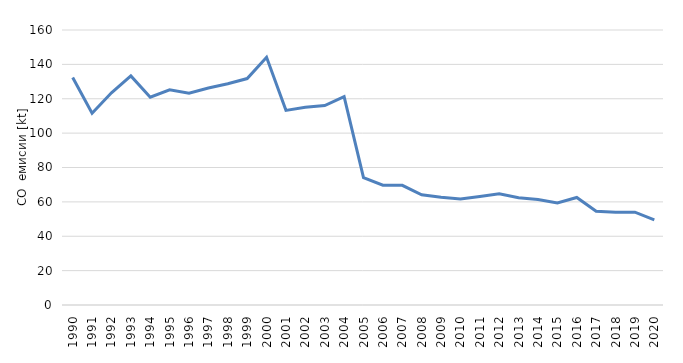
| Category | Series 0 |
|---|---|
| 1990.0 | 132.397 |
| 1991.0 | 111.538 |
| 1992.0 | 123.461 |
| 1993.0 | 133.28 |
| 1994.0 | 120.871 |
| 1995.0 | 125.249 |
| 1996.0 | 123.167 |
| 1997.0 | 126.295 |
| 1998.0 | 128.723 |
| 1999.0 | 131.742 |
| 2000.0 | 144.144 |
| 2001.0 | 113.242 |
| 2002.0 | 115.029 |
| 2003.0 | 116.052 |
| 2004.0 | 121.204 |
| 2005.0 | 74.151 |
| 2006.0 | 69.736 |
| 2007.0 | 69.639 |
| 2008.0 | 64.089 |
| 2009.0 | 62.669 |
| 2010.0 | 61.651 |
| 2011.0 | 63.17 |
| 2012.0 | 64.753 |
| 2013.0 | 62.457 |
| 2014.0 | 61.395 |
| 2015.0 | 59.388 |
| 2016.0 | 62.557 |
| 2017.0 | 54.514 |
| 2018.0 | 53.968 |
| 2019.0 | 54.011 |
| 2020.0 | 49.514 |